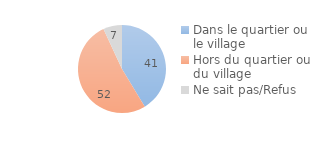
| Category | Series 0 |
|---|---|
| Dans le quartier ou le village | 41.327 |
| Hors du quartier ou du village | 51.76 |
| Ne sait pas/Refus | 6.913 |